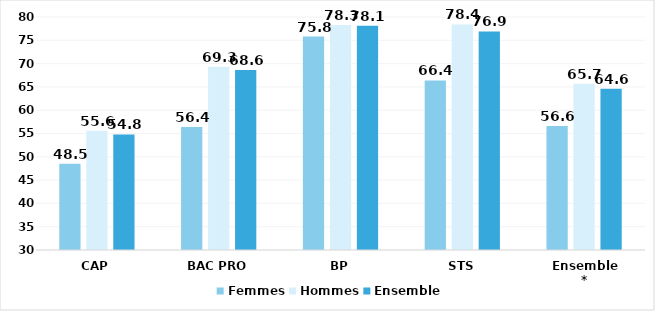
| Category | Femmes | Hommes | Ensemble |
|---|---|---|---|
| CAP | 48.5 | 55.6 | 54.8 |
| BAC PRO | 56.4 | 69.3 | 68.6 |
| BP | 75.8 | 78.3 | 78.1 |
| STS | 66.4 | 78.4 | 76.9 |
| Ensemble* | 56.6 | 65.7 | 64.6 |